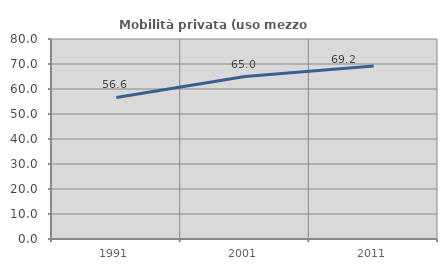
| Category | Mobilità privata (uso mezzo privato) |
|---|---|
| 1991.0 | 56.609 |
| 2001.0 | 64.968 |
| 2011.0 | 69.173 |